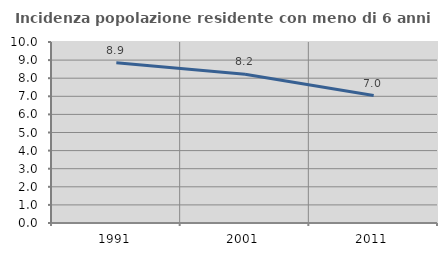
| Category | Incidenza popolazione residente con meno di 6 anni |
|---|---|
| 1991.0 | 8.854 |
| 2001.0 | 8.218 |
| 2011.0 | 7.039 |